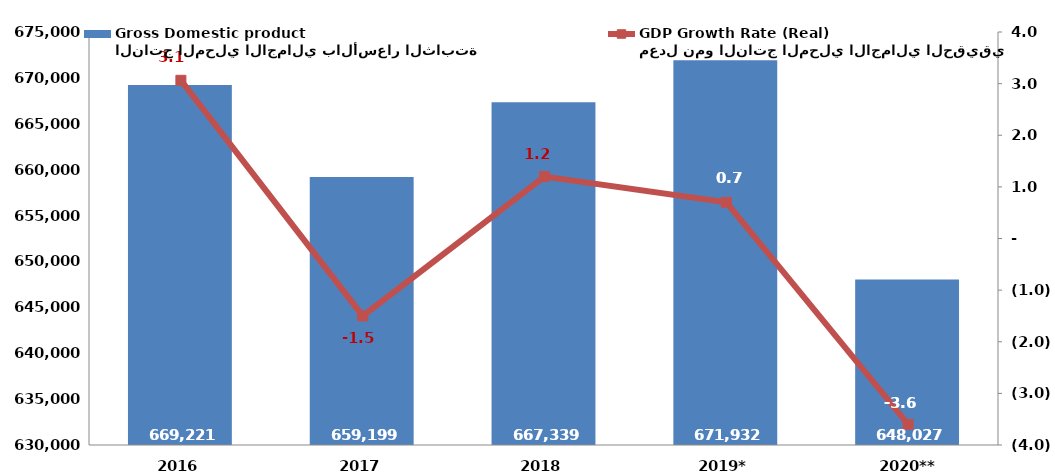
| Category | الناتج المحلي الاجمالي بالأسعار الثابتة
Gross Domestic product |
|---|---|
| 2016 | 669221.256 |
| 2017 | 659198.967 |
| 2018 | 667339.232 |
| 2019* | 671932.134 |
| 2020** | 648027.449 |